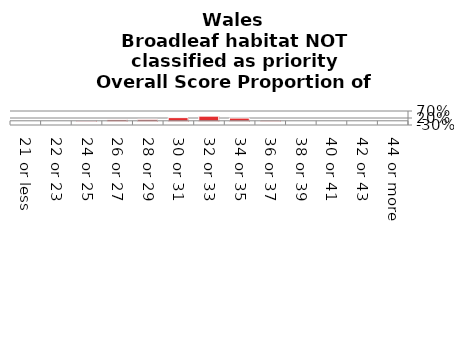
| Category | Broadleaf habitat NOT classified as priority |
|---|---|
| 21 or less | 0 |
| 22 or 23 | 0 |
| 24 or 25 | 0.008 |
| 26 or 27 | 0.085 |
| 28 or 29 | 0.106 |
| 30 or 31 | 0.227 |
| 32 or 33 | 0.333 |
| 34 or 35 | 0.196 |
| 36 or 37 | 0.045 |
| 38 or 39 | 0 |
| 40 or 41 | 0 |
| 42 or 43 | 0 |
| 44 or more | 0 |